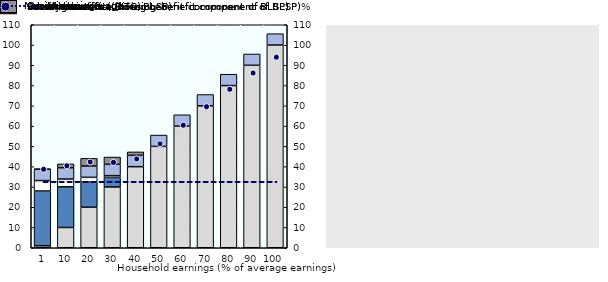
| Category | Gross earnings | Social assistance (living benefit component of BLSP) | Housing benefits (housing benefit component of BLSP) | Family benefits (under BLSP) | In-work benefits (EITC) |
|---|---|---|---|---|---|
| 1.0 | 1 | 27.001 | 5.139 | 5.593 | 0.189 |
| 10.0 | 10 | 20.074 | 3.821 | 5.593 | 1.889 |
| 20.0 | 20 | 12.377 | 2.356 | 5.593 | 3.778 |
| 30.0 | 30 | 4.681 | 0.891 | 5.593 | 3.578 |
| 40.0 | 40 | 0 | 0 | 5.593 | 1.689 |
| 50.0 | 50 | 0 | 0 | 5.593 | 0 |
| 60.0 | 60 | 0 | 0 | 5.593 | 0 |
| 70.0 | 70 | 0 | 0 | 5.593 | 0 |
| 80.0 | 80 | 0 | 0 | 5.593 | 0 |
| 90.0 | 90 | 0 | 0 | 5.593 | 0 |
| 100.0 | 100 | 0 | 0 | 5.593 | 0 |